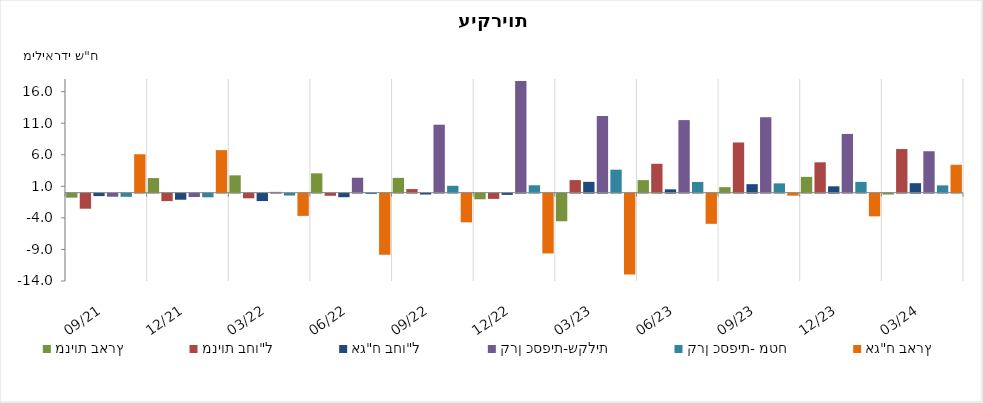
| Category | מניות בארץ | מניות בחו"ל | אג"ח בחו"ל | קרן כספית-שקלית | קרן כספית- מטח | אג"ח בארץ |
|---|---|---|---|---|---|---|
| 2021-09-30 | -0.641 | -2.39 | -0.392 | -0.492 | -0.506 | 6.08 |
| 2021-12-31 | 2.305 | -1.189 | -0.967 | -0.533 | -0.581 | 6.731 |
| 2022-03-31 | 2.736 | -0.743 | -1.177 | 0.118 | -0.305 | -3.528 |
| 2022-06-30 | 3.055 | -0.343 | -0.569 | 2.36 | -0.066 | -9.686 |
| 2022-09-30 | 2.336 | 0.565 | -0.142 | 10.758 | 1.081 | -4.55 |
| 2022-12-31 | -0.895 | -0.835 | -0.198 | 17.674 | 1.163 | -9.478 |
| 2023-03-31 | -4.379 | 1.983 | 1.71 | 12.158 | 3.634 | -12.799 |
| 2023-06-30 | 1.98 | 4.569 | 0.523 | 11.488 | 1.682 | -4.781 |
| 2023-09-30 | 0.865 | 7.942 | 1.341 | 11.941 | 1.465 | -0.325 |
| 2023-12-31 | 2.5 | 4.8 | 1 | 9.3 | 1.7 | -3.6 |
| 2024-03-31 | -0.145 | 6.904 | 1.497 | 6.555 | 1.148 | 4.409 |